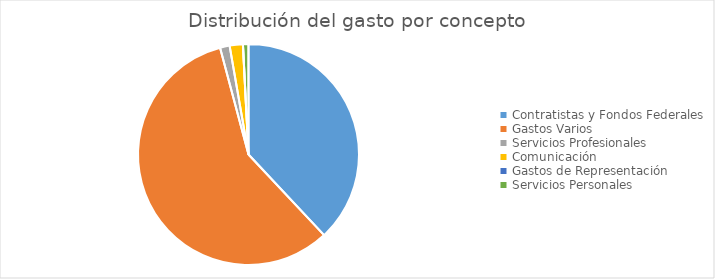
| Category | Series 0 |
|---|---|
| Contratistas y Fondos Federales | 208935714.66 |
| Gastos Varios | 318000977.92 |
| Servicios Profesionales | 7715405.24 |
| Comunicación | 10613252.09 |
| Gastos de Representación | 40400 |
| Servicios Personales | 4415412.69 |